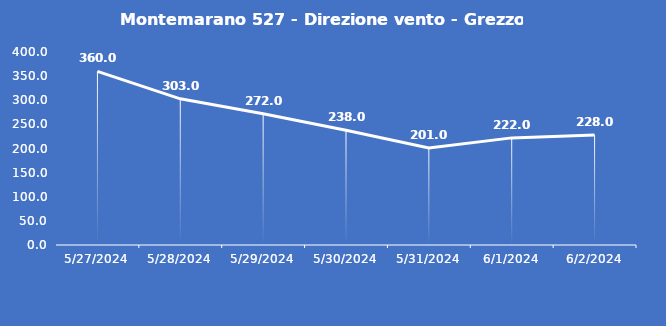
| Category | Montemarano 527 - Direzione vento - Grezzo (°N) |
|---|---|
| 5/27/24 | 360 |
| 5/28/24 | 303 |
| 5/29/24 | 272 |
| 5/30/24 | 238 |
| 5/31/24 | 201 |
| 6/1/24 | 222 |
| 6/2/24 | 228 |